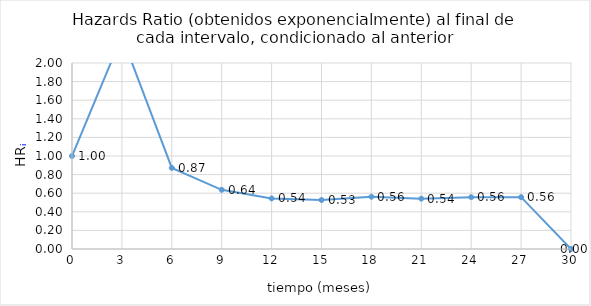
| Category | Series 0 |
|---|---|
| 0.0 | 1 |
| 3.0 | 2.288 |
| 6.0 | 0.872 |
| 9.0 | 0.637 |
| 12.0 | 0.544 |
| 15.0 | 0.527 |
| 18.0 | 0.562 |
| 21.0 | 0.541 |
| 24.0 | 0.557 |
| 27.0 | 0.557 |
| 30.0 | 0 |